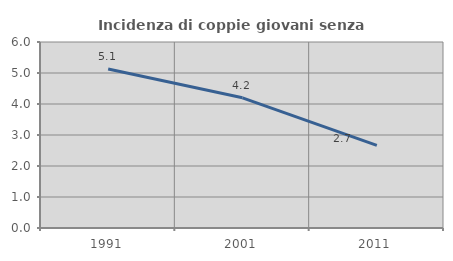
| Category | Incidenza di coppie giovani senza figli |
|---|---|
| 1991.0 | 5.128 |
| 2001.0 | 4.199 |
| 2011.0 | 2.667 |